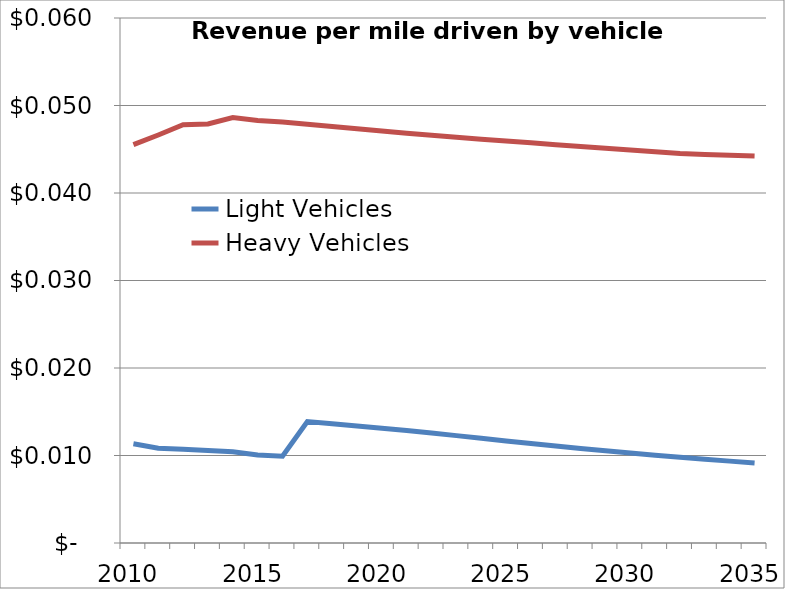
| Category | Light Vehicles | Heavy Vehicles |
|---|---|---|
| 2010.0 | 0.011 | 0.046 |
| 2011.0 | 0.011 | 0.047 |
| 2012.0 | 0.011 | 0.048 |
| 2013.0 | 0.011 | 0.048 |
| 2014.0 | 0.01 | 0.049 |
| 2015.0 | 0.01 | 0.048 |
| 2016.0 | 0.01 | 0.048 |
| 2017.0 | 0.014 | 0.048 |
| 2018.0 | 0.014 | 0.048 |
| 2019.0 | 0.013 | 0.047 |
| 2020.0 | 0.013 | 0.047 |
| 2021.0 | 0.013 | 0.047 |
| 2022.0 | 0.013 | 0.047 |
| 2023.0 | 0.012 | 0.046 |
| 2024.0 | 0.012 | 0.046 |
| 2025.0 | 0.012 | 0.046 |
| 2026.0 | 0.011 | 0.046 |
| 2027.0 | 0.011 | 0.046 |
| 2028.0 | 0.011 | 0.045 |
| 2029.0 | 0.011 | 0.045 |
| 2030.0 | 0.01 | 0.045 |
| 2031.0 | 0.01 | 0.045 |
| 2032.0 | 0.01 | 0.045 |
| 2033.0 | 0.01 | 0.044 |
| 2034.0 | 0.009 | 0.044 |
| 2035.0 | 0.009 | 0.044 |